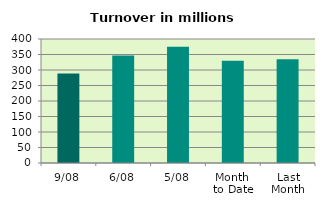
| Category | Series 0 |
|---|---|
| 9/08 | 288.906 |
| 6/08 | 346.542 |
| 5/08 | 375.27 |
| Month 
to Date | 330.197 |
| Last
Month | 334.97 |